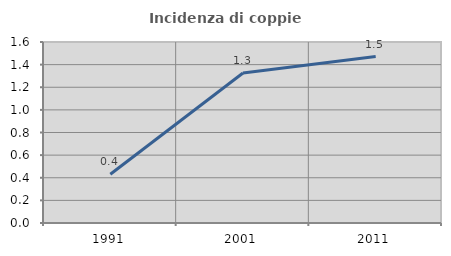
| Category | Incidenza di coppie miste |
|---|---|
| 1991.0 | 0.431 |
| 2001.0 | 1.326 |
| 2011.0 | 1.471 |